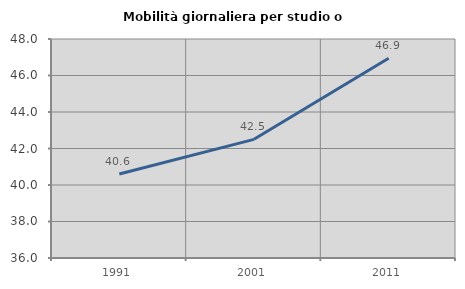
| Category | Mobilità giornaliera per studio o lavoro |
|---|---|
| 1991.0 | 40.599 |
| 2001.0 | 42.502 |
| 2011.0 | 46.944 |